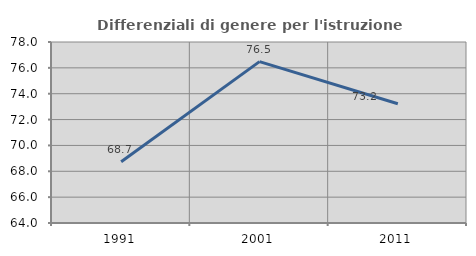
| Category | Differenziali di genere per l'istruzione superiore |
|---|---|
| 1991.0 | 68.744 |
| 2001.0 | 76.481 |
| 2011.0 | 73.222 |